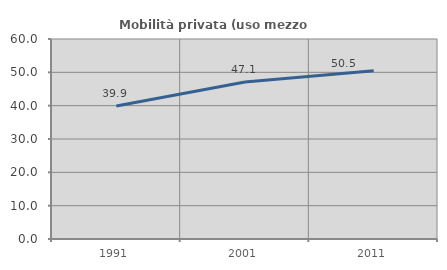
| Category | Mobilità privata (uso mezzo privato) |
|---|---|
| 1991.0 | 39.918 |
| 2001.0 | 47.084 |
| 2011.0 | 50.463 |